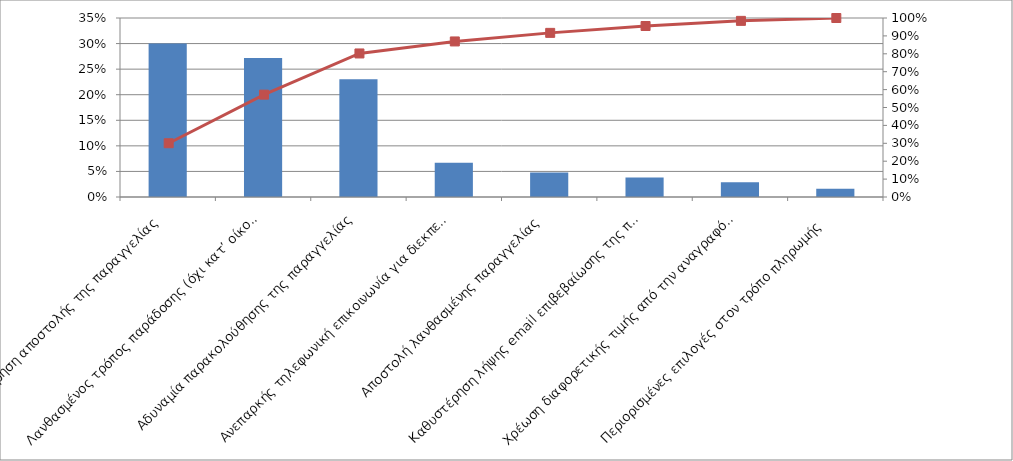
| Category | Series 0 |
|---|---|
| Καθυστέρηση αποστολής της παραγγελίας  | 0.3 |
| Λανθασμένος τρόπος παράδοσης (όχι κατ’ οίκο όπως επιλέχθηκε αλλά με παραλαβή από το κατάστημα)  | 0.272 |
| Αδυναμία παρακολούθησης της παραγγελίας | 0.23 |
| Ανεπαρκής τηλεφωνική επικοινωνία για διεκπεραίωση προβλήματος  | 0.067 |
| Αποστολή λανθασμένης παραγγελίας  | 0.048 |
| Καθυστέρηση λήψης email επιβεβαίωσης της παραγγελίας  | 0.038 |
| Χρέωση διαφορετικής τιμής από την αναγραφόμενη στο site  | 0.029 |
| Περιορισμένες επιλογές στον τρόπο πληρωμής  | 0.016 |